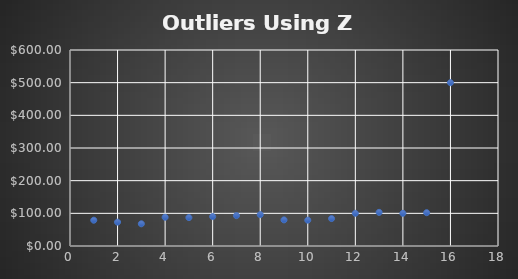
| Category | Sales |
|---|---|
| 0 | 79 |
| 1 | 73 |
| 2 | 68 |
| 3 | 88 |
| 4 | 87 |
| 5 | 90 |
| 6 | 93 |
| 7 | 96 |
| 8 | 80 |
| 9 | 79 |
| 10 | 84 |
| 11 | 100 |
| 12 | 103 |
| 13 | 100 |
| 14 | 102 |
| 15 | 500 |